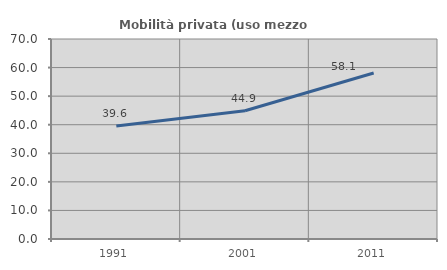
| Category | Mobilità privata (uso mezzo privato) |
|---|---|
| 1991.0 | 39.578 |
| 2001.0 | 44.867 |
| 2011.0 | 58.087 |